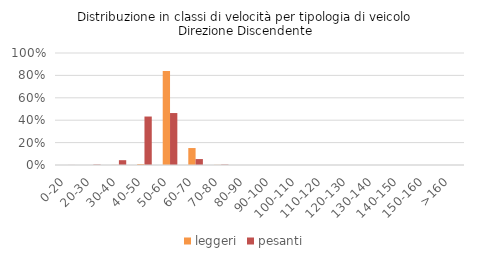
| Category | leggeri | pesanti |
|---|---|---|
| 0-20 | 0 | 0 |
| 20-30 | 0 | 0.004 |
| 30-40 | 0.001 | 0.043 |
| 40-50 | 0.008 | 0.433 |
| 50-60 | 0.838 | 0.464 |
| 60-70 | 0.151 | 0.053 |
| 70-80 | 0.001 | 0.004 |
| 80-90 | 0 | 0 |
| 90-100 | 0 | 0 |
| 100-110 | 0 | 0 |
| 110-120 | 0 | 0 |
| 120-130 | 0 | 0 |
| 130-140 | 0 | 0 |
| 140-150 | 0 | 0 |
| 150-160 | 0 | 0 |
| >160 | 0 | 0 |